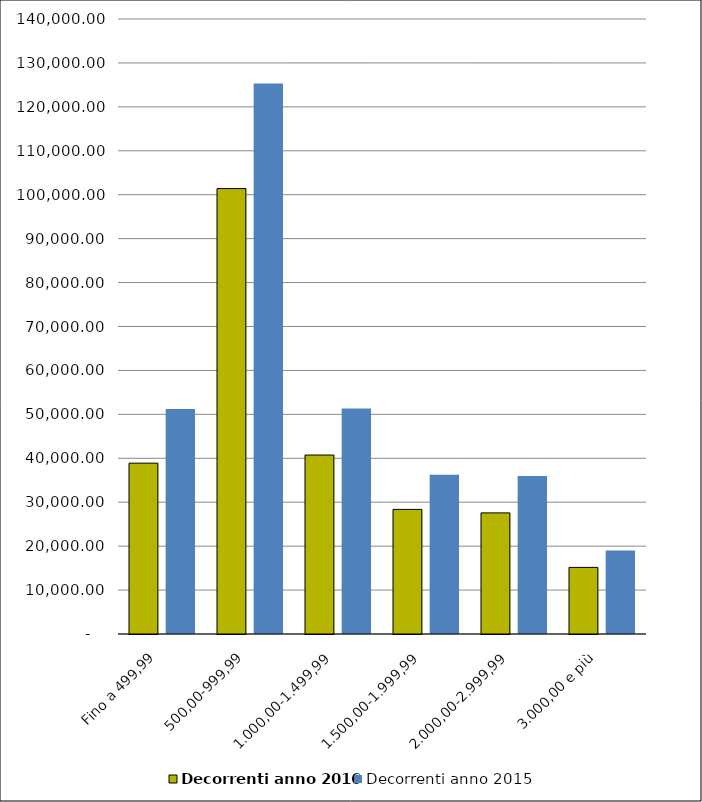
| Category | Decorrenti anno 2016 | Decorrenti anno 2015 |
|---|---|---|
| Fino a 499,99 | 38892 | 51217 |
| 500,00-999,99 | 101397 | 125303 |
| 1.000,00-1.499,99 | 40741 | 51318 |
| 1.500,00-1.999,99 | 28365 | 36247 |
| 2.000,00-2.999,99 | 27570 | 35958 |
| 3.000,00 e più | 15166 | 19034 |